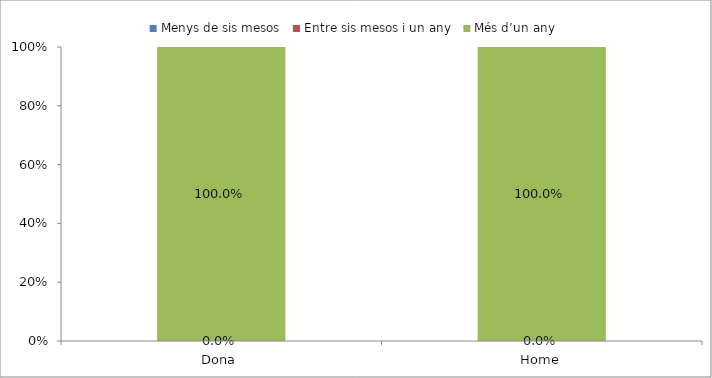
| Category | Menys de sis mesos | Entre sis mesos i un any | Més d’un any |
|---|---|---|---|
| Dona | 0 | 0 | 1 |
| Home | 0 | 0 | 1 |